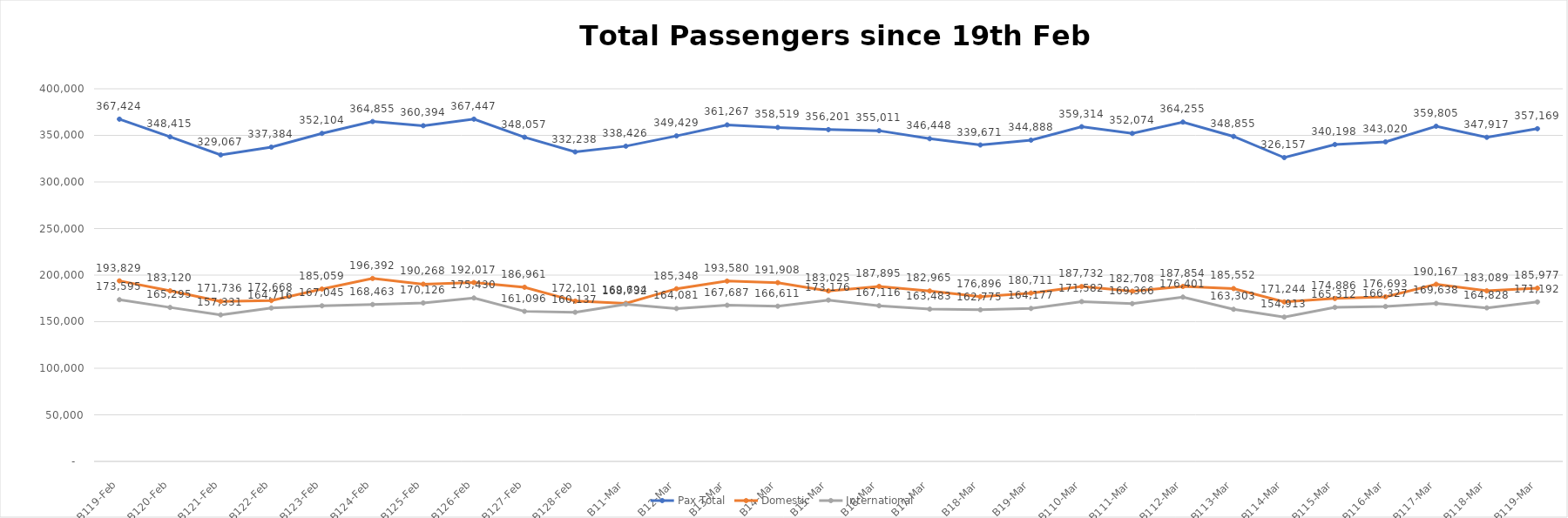
| Category | Pax Total |  Domestic  |  International  |
|---|---|---|---|
| 2023-02-19 | 367424 | 193829 | 173595 |
| 2023-02-20 | 348415 | 183120 | 165295 |
| 2023-02-21 | 329067 | 171736 | 157331 |
| 2023-02-22 | 337384 | 172668 | 164716 |
| 2023-02-23 | 352104 | 185059 | 167045 |
| 2023-02-24 | 364855 | 196392 | 168463 |
| 2023-02-25 | 360394 | 190268 | 170126 |
| 2023-02-26 | 367447 | 192017 | 175430 |
| 2023-02-27 | 348057 | 186961 | 161096 |
| 2023-02-28 | 332238 | 172101 | 160137 |
| 2023-03-01 | 338426 | 169694 | 168732 |
| 2023-03-02 | 349429 | 185348 | 164081 |
| 2023-03-03 | 361267 | 193580 | 167687 |
| 2023-03-04 | 358519 | 191908 | 166611 |
| 2023-03-05 | 356201 | 183025 | 173176 |
| 2023-03-06 | 355011 | 187895 | 167116 |
| 2023-03-07 | 346448 | 182965 | 163483 |
| 2023-03-08 | 339671 | 176896 | 162775 |
| 2023-03-09 | 344888 | 180711 | 164177 |
| 2023-03-10 | 359314 | 187732 | 171582 |
| 2023-03-11 | 352074 | 182708 | 169366 |
| 2023-03-12 | 364255 | 187854 | 176401 |
| 2023-03-13 | 348855 | 185552 | 163303 |
| 2023-03-14 | 326157 | 171244 | 154913 |
| 2023-03-15 | 340198 | 174886 | 165312 |
| 2023-03-16 | 343020 | 176693 | 166327 |
| 2023-03-17 | 359805 | 190167 | 169638 |
| 2023-03-18 | 347917 | 183089 | 164828 |
| 2023-03-19 | 357169 | 185977 | 171192 |